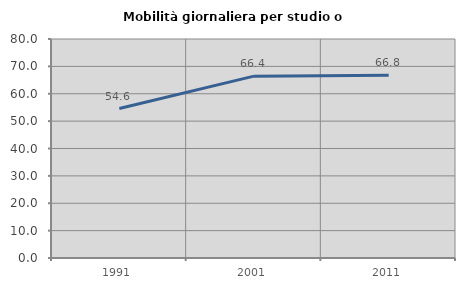
| Category | Mobilità giornaliera per studio o lavoro |
|---|---|
| 1991.0 | 54.59 |
| 2001.0 | 66.43 |
| 2011.0 | 66.757 |